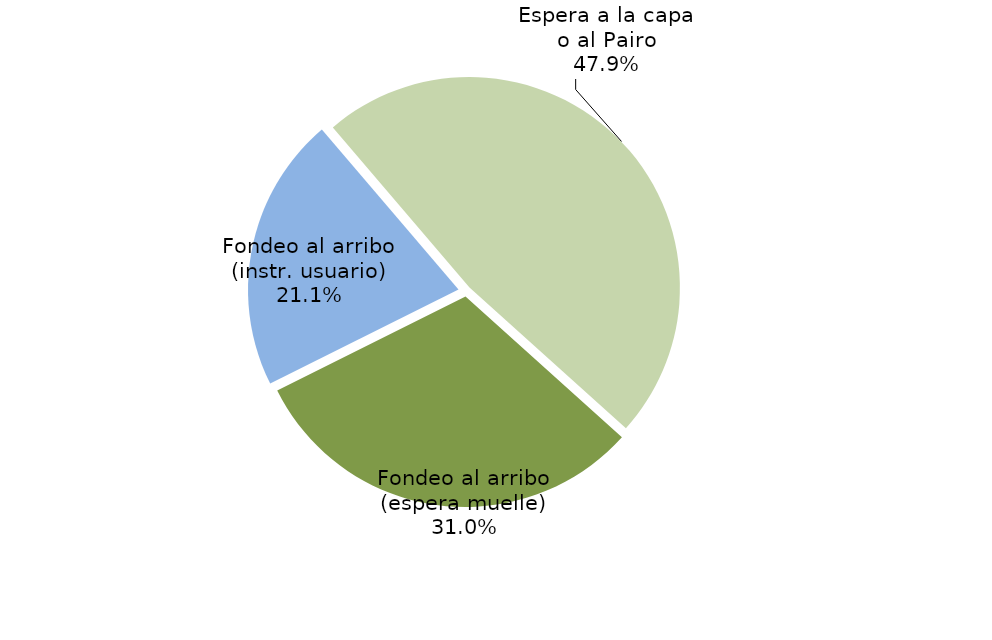
| Category | Series 0 |
|---|---|
| Fondeo al arribo (espera muelle) | 1629.167 |
| Fondeo al arribo (instr. usuario) | 1112.167 |
| Espera a la capa o al Pairo | 2521.4 |